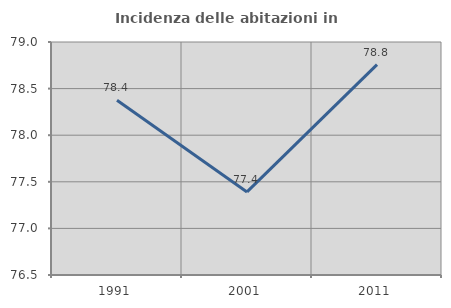
| Category | Incidenza delle abitazioni in proprietà  |
|---|---|
| 1991.0 | 78.374 |
| 2001.0 | 77.391 |
| 2011.0 | 78.757 |